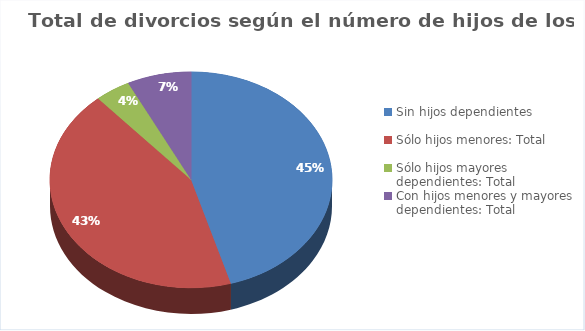
| Category | Series 0 |
|---|---|
| Sin hijos dependientes | 36956 |
| Sólo hijos menores: Total | 35054 |
| Sólo hijos mayores dependientes: Total | 3323 |
| Con hijos menores y mayores dependientes: Total | 5969 |